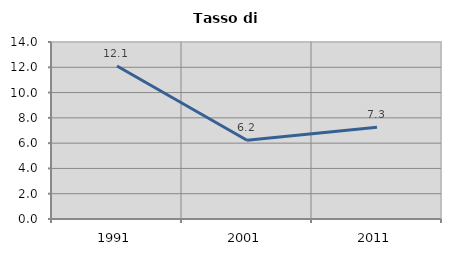
| Category | Tasso di disoccupazione   |
|---|---|
| 1991.0 | 12.1 |
| 2001.0 | 6.226 |
| 2011.0 | 7.252 |